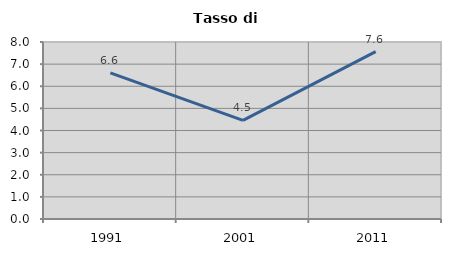
| Category | Tasso di disoccupazione   |
|---|---|
| 1991.0 | 6.604 |
| 2001.0 | 4.454 |
| 2011.0 | 7.564 |